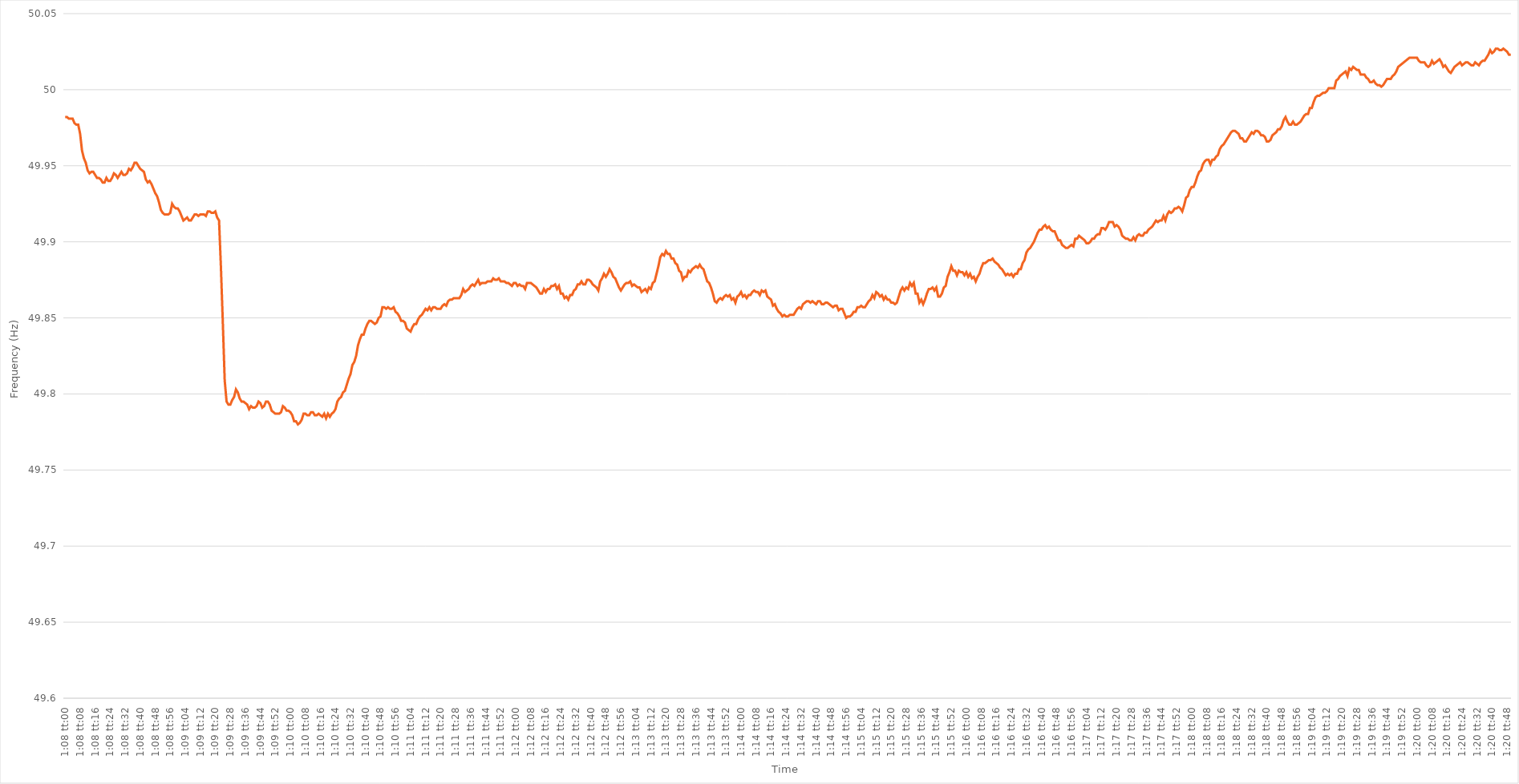
| Category | Series 0 |
|---|---|
| 0.04722222222222222 | 49.982 |
| 0.047233796296296295 | 49.982 |
| 0.047245370370370375 | 49.981 |
| 0.04725694444444445 | 49.981 |
| 0.047268518518518515 | 49.981 |
| 0.04728009259259259 | 49.978 |
| 0.04729166666666667 | 49.977 |
| 0.04730324074074074 | 49.977 |
| 0.04731481481481481 | 49.971 |
| 0.04732638888888888 | 49.96 |
| 0.047337962962962964 | 49.955 |
| 0.04734953703703704 | 49.952 |
| 0.04736111111111111 | 49.947 |
| 0.04737268518518519 | 49.945 |
| 0.04738425925925926 | 49.946 |
| 0.04739583333333333 | 49.946 |
| 0.047407407407407405 | 49.944 |
| 0.047418981481481486 | 49.942 |
| 0.04743055555555556 | 49.942 |
| 0.047442129629629626 | 49.941 |
| 0.0474537037037037 | 49.939 |
| 0.04746527777777778 | 49.939 |
| 0.04747685185185185 | 49.942 |
| 0.04748842592592593 | 49.94 |
| 0.04750000000000001 | 49.94 |
| 0.047511574074074074 | 49.942 |
| 0.04752314814814815 | 49.945 |
| 0.04753472222222222 | 49.944 |
| 0.0475462962962963 | 49.942 |
| 0.04755787037037037 | 49.944 |
| 0.04756944444444444 | 49.946 |
| 0.047581018518518516 | 49.944 |
| 0.047592592592592596 | 49.944 |
| 0.04760416666666667 | 49.945 |
| 0.04761574074074074 | 49.948 |
| 0.04762731481481481 | 49.947 |
| 0.04763888888888889 | 49.949 |
| 0.047650462962962964 | 49.952 |
| 0.04766203703703704 | 49.952 |
| 0.047673611111111104 | 49.95 |
| 0.047685185185185185 | 49.948 |
| 0.04769675925925926 | 49.947 |
| 0.04770833333333333 | 49.946 |
| 0.04771990740740741 | 49.941 |
| 0.047731481481481486 | 49.939 |
| 0.04774305555555555 | 49.94 |
| 0.047754629629629626 | 49.938 |
| 0.04776620370370371 | 49.935 |
| 0.04777777777777778 | 49.932 |
| 0.04778935185185185 | 49.93 |
| 0.04780092592592592 | 49.926 |
| 0.0478125 | 49.921 |
| 0.047824074074074074 | 49.919 |
| 0.04783564814814815 | 49.918 |
| 0.04784722222222223 | 49.918 |
| 0.047858796296296295 | 49.918 |
| 0.04787037037037037 | 49.919 |
| 0.04788194444444444 | 49.925 |
| 0.04789351851851852 | 49.923 |
| 0.04790509259259259 | 49.922 |
| 0.04791666666666666 | 49.922 |
| 0.04792824074074074 | 49.92 |
| 0.04793981481481482 | 49.917 |
| 0.04795138888888889 | 49.914 |
| 0.047962962962962964 | 49.915 |
| 0.047974537037037045 | 49.916 |
| 0.04798611111111111 | 49.914 |
| 0.047997685185185185 | 49.914 |
| 0.04800925925925926 | 49.916 |
| 0.04802083333333334 | 49.918 |
| 0.048032407407407406 | 49.918 |
| 0.04804398148148148 | 49.917 |
| 0.04805555555555555 | 49.918 |
| 0.04806712962962963 | 49.918 |
| 0.04807870370370371 | 49.918 |
| 0.04809027777777778 | 49.917 |
| 0.04810185185185185 | 49.92 |
| 0.04811342592592593 | 49.92 |
| 0.048125 | 49.919 |
| 0.048136574074074075 | 49.919 |
| 0.04814814814814814 | 49.92 |
| 0.04815972222222222 | 49.916 |
| 0.048171296296296295 | 49.914 |
| 0.04818287037037037 | 49.883 |
| 0.04819444444444445 | 49.847 |
| 0.04820601851851852 | 49.809 |
| 0.04821759259259259 | 49.795 |
| 0.04822916666666666 | 49.793 |
| 0.048240740740740744 | 49.793 |
| 0.04825231481481482 | 49.796 |
| 0.048263888888888884 | 49.798 |
| 0.04827546296296296 | 49.803 |
| 0.04828703703703704 | 49.801 |
| 0.04829861111111111 | 49.797 |
| 0.048310185185185185 | 49.795 |
| 0.048321759259259266 | 49.795 |
| 0.04833333333333333 | 49.794 |
| 0.048344907407407406 | 49.793 |
| 0.04835648148148148 | 49.79 |
| 0.04836805555555556 | 49.792 |
| 0.04837962962962963 | 49.791 |
| 0.0483912037037037 | 49.791 |
| 0.048402777777777774 | 49.792 |
| 0.048414351851851854 | 49.795 |
| 0.04842592592592593 | 49.794 |
| 0.0484375 | 49.791 |
| 0.04844907407407408 | 49.792 |
| 0.04846064814814815 | 49.795 |
| 0.04847222222222222 | 49.795 |
| 0.048483796296296296 | 49.793 |
| 0.048495370370370376 | 49.789 |
| 0.04850694444444444 | 49.788 |
| 0.048518518518518516 | 49.787 |
| 0.04853009259259259 | 49.787 |
| 0.04854166666666667 | 49.787 |
| 0.048553240740740744 | 49.788 |
| 0.04856481481481482 | 49.792 |
| 0.048576388888888884 | 49.791 |
| 0.048587962962962965 | 49.789 |
| 0.04859953703703704 | 49.789 |
| 0.04861111111111111 | 49.788 |
| 0.04862268518518518 | 49.786 |
| 0.04863425925925926 | 49.782 |
| 0.04864583333333333 | 49.782 |
| 0.048657407407407406 | 49.78 |
| 0.04866898148148149 | 49.781 |
| 0.04868055555555556 | 49.783 |
| 0.04869212962962963 | 49.787 |
| 0.0487037037037037 | 49.787 |
| 0.04871527777777778 | 49.786 |
| 0.048726851851851855 | 49.786 |
| 0.04873842592592592 | 49.788 |
| 0.048749999999999995 | 49.788 |
| 0.048761574074074075 | 49.786 |
| 0.04877314814814815 | 49.786 |
| 0.04878472222222222 | 49.787 |
| 0.0487962962962963 | 49.786 |
| 0.04880787037037037 | 49.785 |
| 0.04881944444444444 | 49.787 |
| 0.04883101851851852 | 49.784 |
| 0.0488425925925926 | 49.787 |
| 0.048854166666666664 | 49.785 |
| 0.04886574074074074 | 49.787 |
| 0.04887731481481481 | 49.788 |
| 0.04888888888888889 | 49.79 |
| 0.048900462962962965 | 49.795 |
| 0.04891203703703704 | 49.797 |
| 0.048923611111111105 | 49.798 |
| 0.048935185185185186 | 49.801 |
| 0.04894675925925926 | 49.802 |
| 0.04895833333333333 | 49.806 |
| 0.04896990740740741 | 49.81 |
| 0.04898148148148148 | 49.813 |
| 0.048993055555555554 | 49.819 |
| 0.04900462962962963 | 49.821 |
| 0.04901620370370371 | 49.825 |
| 0.04902777777777778 | 49.832 |
| 0.049039351851851855 | 49.836 |
| 0.04905092592592592 | 49.839 |
| 0.0490625 | 49.839 |
| 0.049074074074074076 | 49.843 |
| 0.04908564814814815 | 49.846 |
| 0.049097222222222216 | 49.848 |
| 0.049108796296296296 | 49.848 |
| 0.04912037037037037 | 49.847 |
| 0.04913194444444444 | 49.846 |
| 0.049143518518518524 | 49.847 |
| 0.0491550925925926 | 49.85 |
| 0.049166666666666664 | 49.851 |
| 0.04917824074074074 | 49.857 |
| 0.04918981481481482 | 49.857 |
| 0.04920138888888889 | 49.856 |
| 0.04921296296296296 | 49.857 |
| 0.04922453703703703 | 49.856 |
| 0.04923611111111111 | 49.856 |
| 0.049247685185185186 | 49.857 |
| 0.04925925925925926 | 49.854 |
| 0.04927083333333334 | 49.853 |
| 0.04928240740740741 | 49.851 |
| 0.04929398148148148 | 49.848 |
| 0.049305555555555554 | 49.848 |
| 0.049317129629629634 | 49.847 |
| 0.0493287037037037 | 49.843 |
| 0.049340277777777775 | 49.842 |
| 0.04935185185185185 | 49.841 |
| 0.04936342592592593 | 49.844 |
| 0.049375 | 49.846 |
| 0.049386574074074076 | 49.846 |
| 0.04939814814814814 | 49.849 |
| 0.04940972222222222 | 49.851 |
| 0.049421296296296297 | 49.852 |
| 0.04943287037037037 | 49.854 |
| 0.04944444444444444 | 49.856 |
| 0.04945601851851852 | 49.855 |
| 0.04946759259259259 | 49.857 |
| 0.049479166666666664 | 49.855 |
| 0.049490740740740745 | 49.857 |
| 0.04950231481481482 | 49.857 |
| 0.04951388888888889 | 49.856 |
| 0.04952546296296296 | 49.856 |
| 0.04953703703703704 | 49.856 |
| 0.04954861111111111 | 49.858 |
| 0.049560185185185186 | 49.859 |
| 0.04957175925925925 | 49.858 |
| 0.04958333333333333 | 49.861 |
| 0.04959490740740741 | 49.862 |
| 0.04960648148148148 | 49.862 |
| 0.04961805555555556 | 49.863 |
| 0.049629629629629635 | 49.863 |
| 0.0496412037037037 | 49.863 |
| 0.049652777777777775 | 49.863 |
| 0.049664351851851855 | 49.865 |
| 0.04967592592592593 | 49.869 |
| 0.049687499999999996 | 49.867 |
| 0.04969907407407407 | 49.868 |
| 0.04971064814814815 | 49.869 |
| 0.04972222222222222 | 49.871 |
| 0.0497337962962963 | 49.872 |
| 0.04974537037037038 | 49.871 |
| 0.049756944444444444 | 49.873 |
| 0.04976851851851852 | 49.875 |
| 0.04978009259259259 | 49.872 |
| 0.04979166666666667 | 49.873 |
| 0.04980324074074074 | 49.873 |
| 0.04981481481481481 | 49.873 |
| 0.049826388888888885 | 49.874 |
| 0.049837962962962966 | 49.874 |
| 0.04984953703703704 | 49.874 |
| 0.04986111111111111 | 49.876 |
| 0.04987268518518518 | 49.875 |
| 0.04988425925925926 | 49.875 |
| 0.049895833333333334 | 49.876 |
| 0.04990740740740741 | 49.874 |
| 0.049918981481481474 | 49.874 |
| 0.049930555555555554 | 49.874 |
| 0.04994212962962963 | 49.873 |
| 0.0499537037037037 | 49.873 |
| 0.04996527777777778 | 49.872 |
| 0.049976851851851856 | 49.871 |
| 0.04998842592592592 | 49.873 |
| 0.049999999999999996 | 49.873 |
| 0.050011574074074076 | 49.871 |
| 0.05002314814814815 | 49.872 |
| 0.050034722222222223 | 49.871 |
| 0.05004629629629629 | 49.871 |
| 0.05005787037037037 | 49.869 |
| 0.050069444444444444 | 49.873 |
| 0.05008101851851852 | 49.873 |
| 0.0500925925925926 | 49.873 |
| 0.05010416666666667 | 49.872 |
| 0.05011574074074074 | 49.871 |
| 0.05012731481481481 | 49.87 |
| 0.05013888888888889 | 49.868 |
| 0.050150462962962966 | 49.866 |
| 0.05016203703703703 | 49.866 |
| 0.050173611111111106 | 49.869 |
| 0.05018518518518519 | 49.867 |
| 0.05019675925925926 | 49.869 |
| 0.050208333333333334 | 49.869 |
| 0.050219907407407414 | 49.871 |
| 0.05023148148148148 | 49.871 |
| 0.050243055555555555 | 49.872 |
| 0.05025462962962963 | 49.869 |
| 0.05026620370370371 | 49.871 |
| 0.050277777777777775 | 49.866 |
| 0.05028935185185185 | 49.866 |
| 0.05030092592592592 | 49.863 |
| 0.0503125 | 49.864 |
| 0.05032407407407408 | 49.862 |
| 0.05033564814814815 | 49.865 |
| 0.05034722222222222 | 49.865 |
| 0.0503587962962963 | 49.868 |
| 0.05037037037037037 | 49.869 |
| 0.050381944444444444 | 49.872 |
| 0.05039351851851851 | 49.872 |
| 0.05040509259259259 | 49.874 |
| 0.050416666666666665 | 49.872 |
| 0.05042824074074074 | 49.872 |
| 0.05043981481481482 | 49.875 |
| 0.05045138888888889 | 49.875 |
| 0.05046296296296296 | 49.874 |
| 0.05047453703703703 | 49.872 |
| 0.050486111111111114 | 49.871 |
| 0.05049768518518519 | 49.87 |
| 0.050509259259259254 | 49.868 |
| 0.05052083333333333 | 49.874 |
| 0.05053240740740741 | 49.876 |
| 0.05054398148148148 | 49.879 |
| 0.050555555555555555 | 49.877 |
| 0.050567129629629635 | 49.879 |
| 0.05057870370370371 | 49.882 |
| 0.050590277777777776 | 49.88 |
| 0.05060185185185185 | 49.877 |
| 0.05061342592592593 | 49.876 |
| 0.050625 | 49.873 |
| 0.05063657407407407 | 49.87 |
| 0.050648148148148144 | 49.868 |
| 0.050659722222222224 | 49.87 |
| 0.0506712962962963 | 49.872 |
| 0.05068287037037037 | 49.873 |
| 0.05069444444444445 | 49.873 |
| 0.05070601851851852 | 49.874 |
| 0.05071759259259259 | 49.871 |
| 0.050729166666666665 | 49.872 |
| 0.050740740740740746 | 49.871 |
| 0.05075231481481481 | 49.87 |
| 0.050763888888888886 | 49.87 |
| 0.05077546296296296 | 49.867 |
| 0.05078703703703704 | 49.868 |
| 0.050798611111111114 | 49.869 |
| 0.05081018518518519 | 49.867 |
| 0.050821759259259254 | 49.87 |
| 0.050833333333333335 | 49.869 |
| 0.05084490740740741 | 49.873 |
| 0.05085648148148148 | 49.874 |
| 0.05086805555555555 | 49.879 |
| 0.05087962962962963 | 49.884 |
| 0.0508912037037037 | 49.89 |
| 0.050902777777777776 | 49.892 |
| 0.050914351851851856 | 49.891 |
| 0.05092592592592593 | 49.894 |
| 0.0509375 | 49.892 |
| 0.05094907407407407 | 49.892 |
| 0.05096064814814815 | 49.889 |
| 0.050972222222222224 | 49.889 |
| 0.05098379629629629 | 49.886 |
| 0.050995370370370365 | 49.885 |
| 0.051006944444444445 | 49.881 |
| 0.05101851851851852 | 49.88 |
| 0.05103009259259259 | 49.875 |
| 0.05104166666666667 | 49.877 |
| 0.051053240740740746 | 49.877 |
| 0.05106481481481481 | 49.881 |
| 0.051076388888888886 | 49.88 |
| 0.05108796296296297 | 49.882 |
| 0.05109953703703704 | 49.883 |
| 0.05111111111111111 | 49.884 |
| 0.05112268518518518 | 49.883 |
| 0.05113425925925926 | 49.885 |
| 0.051145833333333335 | 49.883 |
| 0.05115740740740741 | 49.882 |
| 0.05116898148148149 | 49.878 |
| 0.051180555555555556 | 49.874 |
| 0.05119212962962963 | 49.873 |
| 0.0512037037037037 | 49.87 |
| 0.05121527777777778 | 49.866 |
| 0.05122685185185185 | 49.861 |
| 0.05123842592592592 | 49.86 |
| 0.05125 | 49.862 |
| 0.05126157407407408 | 49.863 |
| 0.05127314814814815 | 49.862 |
| 0.051284722222222225 | 49.864 |
| 0.05129629629629629 | 49.865 |
| 0.05130787037037037 | 49.864 |
| 0.051319444444444445 | 49.865 |
| 0.05133101851851852 | 49.862 |
| 0.051342592592592586 | 49.863 |
| 0.051354166666666666 | 49.86 |
| 0.05136574074074074 | 49.864 |
| 0.05137731481481481 | 49.865 |
| 0.051388888888888894 | 49.867 |
| 0.05140046296296297 | 49.864 |
| 0.051412037037037034 | 49.865 |
| 0.05142361111111111 | 49.863 |
| 0.05143518518518519 | 49.865 |
| 0.05144675925925926 | 49.865 |
| 0.05145833333333333 | 49.867 |
| 0.0514699074074074 | 49.868 |
| 0.05148148148148148 | 49.867 |
| 0.051493055555555556 | 49.867 |
| 0.05150462962962963 | 49.865 |
| 0.05151620370370371 | 49.868 |
| 0.051527777777777777 | 49.867 |
| 0.05153935185185185 | 49.868 |
| 0.051550925925925924 | 49.864 |
| 0.051562500000000004 | 49.863 |
| 0.05157407407407408 | 49.862 |
| 0.051585648148148144 | 49.858 |
| 0.05159722222222222 | 49.859 |
| 0.0516087962962963 | 49.856 |
| 0.05162037037037037 | 49.854 |
| 0.051631944444444446 | 49.853 |
| 0.051643518518518526 | 49.851 |
| 0.05165509259259259 | 49.852 |
| 0.051666666666666666 | 49.851 |
| 0.05167824074074074 | 49.851 |
| 0.05168981481481482 | 49.852 |
| 0.05170138888888889 | 49.852 |
| 0.05171296296296296 | 49.852 |
| 0.051724537037037034 | 49.854 |
| 0.051736111111111115 | 49.856 |
| 0.05174768518518519 | 49.857 |
| 0.05175925925925926 | 49.856 |
| 0.05177083333333333 | 49.859 |
| 0.05178240740740741 | 49.86 |
| 0.05179398148148148 | 49.861 |
| 0.051805555555555556 | 49.861 |
| 0.05181712962962962 | 49.86 |
| 0.0518287037037037 | 49.861 |
| 0.05184027777777778 | 49.86 |
| 0.05185185185185185 | 49.859 |
| 0.05186342592592593 | 49.861 |
| 0.051875000000000004 | 49.861 |
| 0.05188657407407407 | 49.859 |
| 0.051898148148148145 | 49.859 |
| 0.051909722222222225 | 49.86 |
| 0.0519212962962963 | 49.86 |
| 0.051932870370370365 | 49.859 |
| 0.05194444444444444 | 49.858 |
| 0.05195601851851852 | 49.857 |
| 0.05196759259259259 | 49.858 |
| 0.05197916666666667 | 49.858 |
| 0.05199074074074075 | 49.855 |
| 0.052002314814814814 | 49.856 |
| 0.05201388888888889 | 49.856 |
| 0.05202546296296296 | 49.853 |
| 0.05203703703703704 | 49.85 |
| 0.05204861111111111 | 49.851 |
| 0.05206018518518518 | 49.851 |
| 0.052071759259259255 | 49.852 |
| 0.052083333333333336 | 49.854 |
| 0.05209490740740741 | 49.854 |
| 0.05210648148148148 | 49.857 |
| 0.05211805555555556 | 49.857 |
| 0.05212962962962963 | 49.858 |
| 0.052141203703703703 | 49.857 |
| 0.05215277777777778 | 49.857 |
| 0.05216435185185186 | 49.859 |
| 0.052175925925925924 | 49.861 |
| 0.0521875 | 49.862 |
| 0.05219907407407407 | 49.865 |
| 0.05221064814814815 | 49.863 |
| 0.052222222222222225 | 49.867 |
| 0.0522337962962963 | 49.866 |
| 0.052245370370370366 | 49.864 |
| 0.052256944444444446 | 49.865 |
| 0.05226851851851852 | 49.862 |
| 0.05228009259259259 | 49.864 |
| 0.05229166666666666 | 49.862 |
| 0.05230324074074074 | 49.862 |
| 0.052314814814814814 | 49.86 |
| 0.05232638888888889 | 49.86 |
| 0.05233796296296297 | 49.859 |
| 0.05234953703703704 | 49.86 |
| 0.05236111111111111 | 49.864 |
| 0.05237268518518518 | 49.868 |
| 0.05238425925925926 | 49.87 |
| 0.052395833333333336 | 49.868 |
| 0.0524074074074074 | 49.87 |
| 0.052418981481481476 | 49.869 |
| 0.05243055555555556 | 49.873 |
| 0.05244212962962963 | 49.871 |
| 0.052453703703703704 | 49.873 |
| 0.052465277777777784 | 49.866 |
| 0.05247685185185185 | 49.866 |
| 0.052488425925925924 | 49.86 |
| 0.0525 | 49.862 |
| 0.05251157407407408 | 49.859 |
| 0.052523148148148145 | 49.862 |
| 0.05253472222222222 | 49.866 |
| 0.05254629629629629 | 49.869 |
| 0.05255787037037037 | 49.869 |
| 0.052569444444444446 | 49.87 |
| 0.05258101851851852 | 49.868 |
| 0.05259259259259259 | 49.87 |
| 0.05260416666666667 | 49.864 |
| 0.05261574074074074 | 49.864 |
| 0.052627314814814814 | 49.866 |
| 0.052638888888888895 | 49.87 |
| 0.05265046296296296 | 49.871 |
| 0.052662037037037035 | 49.877 |
| 0.05267361111111111 | 49.88 |
| 0.05268518518518519 | 49.884 |
| 0.05269675925925926 | 49.881 |
| 0.052708333333333336 | 49.881 |
| 0.0527199074074074 | 49.878 |
| 0.05273148148148148 | 49.881 |
| 0.05274305555555556 | 49.88 |
| 0.05275462962962963 | 49.88 |
| 0.0527662037037037 | 49.878 |
| 0.05277777777777778 | 49.88 |
| 0.05278935185185185 | 49.877 |
| 0.052800925925925925 | 49.879 |
| 0.052812500000000005 | 49.876 |
| 0.05282407407407408 | 49.877 |
| 0.052835648148148145 | 49.874 |
| 0.05284722222222222 | 49.877 |
| 0.0528587962962963 | 49.879 |
| 0.05287037037037037 | 49.883 |
| 0.05288194444444444 | 49.886 |
| 0.05289351851851851 | 49.886 |
| 0.052905092592592594 | 49.887 |
| 0.05291666666666667 | 49.888 |
| 0.05292824074074074 | 49.888 |
| 0.05293981481481482 | 49.889 |
| 0.05295138888888889 | 49.887 |
| 0.05296296296296296 | 49.886 |
| 0.052974537037037035 | 49.885 |
| 0.052986111111111116 | 49.883 |
| 0.05299768518518518 | 49.882 |
| 0.053009259259259256 | 49.88 |
| 0.05302083333333333 | 49.878 |
| 0.05303240740740741 | 49.879 |
| 0.053043981481481484 | 49.878 |
| 0.05305555555555556 | 49.879 |
| 0.05306712962962964 | 49.877 |
| 0.053078703703703704 | 49.879 |
| 0.05309027777777778 | 49.879 |
| 0.05310185185185185 | 49.882 |
| 0.05311342592592593 | 49.882 |
| 0.053125 | 49.886 |
| 0.05313657407407407 | 49.888 |
| 0.053148148148148146 | 49.893 |
| 0.053159722222222226 | 49.895 |
| 0.0531712962962963 | 49.896 |
| 0.053182870370370366 | 49.898 |
| 0.05319444444444444 | 49.9 |
| 0.05320601851851852 | 49.903 |
| 0.053217592592592594 | 49.906 |
| 0.05322916666666666 | 49.908 |
| 0.053240740740740734 | 49.908 |
| 0.053252314814814815 | 49.91 |
| 0.05326388888888889 | 49.911 |
| 0.05327546296296296 | 49.909 |
| 0.05328703703703704 | 49.91 |
| 0.053298611111111116 | 49.908 |
| 0.05331018518518518 | 49.907 |
| 0.053321759259259256 | 49.907 |
| 0.05333333333333334 | 49.904 |
| 0.05334490740740741 | 49.901 |
| 0.05335648148148148 | 49.901 |
| 0.05336805555555555 | 49.898 |
| 0.05337962962962963 | 49.897 |
| 0.053391203703703705 | 49.896 |
| 0.05340277777777778 | 49.896 |
| 0.05341435185185186 | 49.897 |
| 0.053425925925925925 | 49.898 |
| 0.0534375 | 49.897 |
| 0.05344907407407407 | 49.902 |
| 0.05346064814814815 | 49.902 |
| 0.05347222222222222 | 49.904 |
| 0.05348379629629629 | 49.903 |
| 0.05349537037037037 | 49.902 |
| 0.05350694444444445 | 49.901 |
| 0.05351851851851852 | 49.899 |
| 0.053530092592592594 | 49.899 |
| 0.053541666666666675 | 49.9 |
| 0.05355324074074074 | 49.902 |
| 0.053564814814814815 | 49.902 |
| 0.05357638888888889 | 49.904 |
| 0.05358796296296297 | 49.905 |
| 0.053599537037037036 | 49.905 |
| 0.05361111111111111 | 49.909 |
| 0.05362268518518518 | 49.909 |
| 0.05363425925925926 | 49.908 |
| 0.05364583333333334 | 49.91 |
| 0.053657407407407404 | 49.913 |
| 0.05366898148148148 | 49.913 |
| 0.05368055555555556 | 49.913 |
| 0.05369212962962963 | 49.91 |
| 0.0537037037037037 | 49.911 |
| 0.05371527777777777 | 49.91 |
| 0.05372685185185185 | 49.908 |
| 0.053738425925925926 | 49.904 |
| 0.05375 | 49.903 |
| 0.05376157407407408 | 49.902 |
| 0.05377314814814815 | 49.902 |
| 0.05378472222222222 | 49.901 |
| 0.05379629629629629 | 49.901 |
| 0.053807870370370374 | 49.903 |
| 0.05381944444444445 | 49.901 |
| 0.053831018518518514 | 49.904 |
| 0.05384259259259259 | 49.905 |
| 0.05385416666666667 | 49.904 |
| 0.05386574074074074 | 49.904 |
| 0.053877314814814815 | 49.906 |
| 0.053888888888888896 | 49.906 |
| 0.05390046296296296 | 49.908 |
| 0.053912037037037036 | 49.909 |
| 0.05392361111111111 | 49.91 |
| 0.05393518518518519 | 49.912 |
| 0.05394675925925926 | 49.914 |
| 0.05395833333333333 | 49.913 |
| 0.053969907407407404 | 49.914 |
| 0.053981481481481484 | 49.914 |
| 0.05399305555555556 | 49.917 |
| 0.05400462962962963 | 49.914 |
| 0.05401620370370371 | 49.918 |
| 0.05402777777777778 | 49.92 |
| 0.05403935185185185 | 49.919 |
| 0.054050925925925926 | 49.92 |
| 0.054062500000000006 | 49.922 |
| 0.05407407407407407 | 49.922 |
| 0.05408564814814815 | 49.923 |
| 0.05409722222222222 | 49.922 |
| 0.0541087962962963 | 49.92 |
| 0.054120370370370374 | 49.924 |
| 0.05413194444444444 | 49.929 |
| 0.054143518518518514 | 49.93 |
| 0.054155092592592595 | 49.934 |
| 0.05416666666666667 | 49.936 |
| 0.054178240740740735 | 49.936 |
| 0.05418981481481481 | 49.939 |
| 0.05420138888888889 | 49.943 |
| 0.05421296296296296 | 49.946 |
| 0.054224537037037036 | 49.947 |
| 0.05423611111111112 | 49.951 |
| 0.05424768518518519 | 49.953 |
| 0.05425925925925926 | 49.954 |
| 0.05427083333333333 | 49.954 |
| 0.05428240740740741 | 49.951 |
| 0.054293981481481485 | 49.954 |
| 0.05430555555555555 | 49.954 |
| 0.054317129629629625 | 49.956 |
| 0.054328703703703705 | 49.957 |
| 0.05434027777777778 | 49.961 |
| 0.05435185185185185 | 49.963 |
| 0.05436342592592593 | 49.964 |
| 0.054375 | 49.966 |
| 0.05438657407407407 | 49.968 |
| 0.05439814814814815 | 49.97 |
| 0.05440972222222223 | 49.972 |
| 0.054421296296296294 | 49.973 |
| 0.05443287037037037 | 49.973 |
| 0.05444444444444444 | 49.972 |
| 0.05445601851851852 | 49.971 |
| 0.054467592592592595 | 49.968 |
| 0.05447916666666667 | 49.968 |
| 0.054490740740740735 | 49.966 |
| 0.054502314814814816 | 49.966 |
| 0.05451388888888889 | 49.968 |
| 0.05452546296296296 | 49.97 |
| 0.054537037037037044 | 49.972 |
| 0.05454861111111111 | 49.971 |
| 0.054560185185185184 | 49.973 |
| 0.05457175925925926 | 49.973 |
| 0.05458333333333334 | 49.972 |
| 0.05459490740740741 | 49.97 |
| 0.05460648148148148 | 49.97 |
| 0.05461805555555555 | 49.969 |
| 0.05462962962962963 | 49.966 |
| 0.054641203703703706 | 49.966 |
| 0.05465277777777777 | 49.967 |
| 0.054664351851851846 | 49.97 |
| 0.054675925925925926 | 49.971 |
| 0.0546875 | 49.972 |
| 0.054699074074074074 | 49.974 |
| 0.054710648148148154 | 49.974 |
| 0.05472222222222223 | 49.976 |
| 0.054733796296296294 | 49.98 |
| 0.05474537037037037 | 49.982 |
| 0.05475694444444445 | 49.979 |
| 0.05476851851851852 | 49.977 |
| 0.05478009259259259 | 49.977 |
| 0.05479166666666666 | 49.979 |
| 0.05480324074074074 | 49.977 |
| 0.054814814814814816 | 49.977 |
| 0.05482638888888889 | 49.978 |
| 0.054837962962962956 | 49.979 |
| 0.05484953703703704 | 49.981 |
| 0.05486111111111111 | 49.983 |
| 0.054872685185185184 | 49.984 |
| 0.054884259259259265 | 49.984 |
| 0.05489583333333333 | 49.988 |
| 0.054907407407407405 | 49.988 |
| 0.05491898148148148 | 49.992 |
| 0.05493055555555556 | 49.995 |
| 0.05494212962962963 | 49.996 |
| 0.054953703703703706 | 49.996 |
| 0.05496527777777777 | 49.997 |
| 0.05497685185185185 | 49.998 |
| 0.05498842592592593 | 49.998 |
| 0.055 | 49.999 |
| 0.05501157407407407 | 50.001 |
| 0.05502314814814815 | 50.001 |
| 0.05503472222222222 | 50.001 |
| 0.055046296296296295 | 50.001 |
| 0.055057870370370375 | 50.006 |
| 0.05506944444444445 | 50.007 |
| 0.055081018518518515 | 50.009 |
| 0.05509259259259259 | 50.01 |
| 0.05510416666666667 | 50.011 |
| 0.05511574074074074 | 50.012 |
| 0.05512731481481481 | 50.009 |
| 0.05513888888888888 | 50.014 |
| 0.055150462962962964 | 50.013 |
| 0.05516203703703704 | 50.015 |
| 0.05517361111111111 | 50.014 |
| 0.05518518518518519 | 50.013 |
| 0.055196759259259265 | 50.013 |
| 0.05520833333333333 | 50.01 |
| 0.055219907407407405 | 50.01 |
| 0.055231481481481486 | 50.01 |
| 0.05524305555555556 | 50.008 |
| 0.055254629629629626 | 50.007 |
| 0.0552662037037037 | 50.005 |
| 0.05527777777777778 | 50.005 |
| 0.05528935185185185 | 50.006 |
| 0.05530092592592593 | 50.004 |
| 0.055312499999999994 | 50.003 |
| 0.055324074074074074 | 50.003 |
| 0.05533564814814815 | 50.002 |
| 0.05534722222222222 | 50.003 |
| 0.05535879629629629 | 50.005 |
| 0.05537037037037037 | 50.007 |
| 0.05538194444444444 | 50.007 |
| 0.055393518518518516 | 50.007 |
| 0.055405092592592596 | 50.009 |
| 0.05541666666666667 | 50.01 |
| 0.05542824074074074 | 50.012 |
| 0.05543981481481481 | 50.015 |
| 0.05545138888888889 | 50.016 |
| 0.055462962962962964 | 50.017 |
| 0.05547453703703704 | 50.018 |
| 0.055486111111111104 | 50.019 |
| 0.055497685185185185 | 50.02 |
| 0.05550925925925926 | 50.021 |
| 0.05552083333333333 | 50.021 |
| 0.05553240740740741 | 50.021 |
| 0.055543981481481486 | 50.021 |
| 0.05555555555555555 | 50.021 |
| 0.055567129629629626 | 50.019 |
| 0.05557870370370371 | 50.018 |
| 0.05559027777777778 | 50.018 |
| 0.05560185185185185 | 50.018 |
| 0.05561342592592592 | 50.016 |
| 0.055625 | 50.015 |
| 0.055636574074074074 | 50.016 |
| 0.05564814814814815 | 50.019 |
| 0.05565972222222223 | 50.017 |
| 0.0556712962962963 | 50.018 |
| 0.05568287037037037 | 50.019 |
| 0.05569444444444444 | 50.02 |
| 0.05570601851851852 | 50.018 |
| 0.055717592592592596 | 50.015 |
| 0.05572916666666666 | 50.016 |
| 0.05574074074074074 | 50.014 |
| 0.05575231481481482 | 50.012 |
| 0.05576388888888889 | 50.011 |
| 0.055775462962962964 | 50.013 |
| 0.05578703703703703 | 50.015 |
| 0.05579861111111111 | 50.016 |
| 0.055810185185185185 | 50.017 |
| 0.05582175925925926 | 50.018 |
| 0.055833333333333325 | 50.016 |
| 0.055844907407407406 | 50.017 |
| 0.05585648148148148 | 50.018 |
| 0.05586805555555555 | 50.018 |
| 0.05587962962962963 | 50.017 |
| 0.05589120370370371 | 50.016 |
| 0.05590277777777778 | 50.016 |
| 0.05591435185185185 | 50.018 |
| 0.05592592592592593 | 50.017 |
| 0.0559375 | 50.016 |
| 0.055949074074074075 | 50.018 |
| 0.05596064814814814 | 50.019 |
| 0.05597222222222222 | 50.019 |
| 0.055983796296296295 | 50.021 |
| 0.05599537037037037 | 50.023 |
| 0.05600694444444445 | 50.026 |
| 0.05601851851851852 | 50.024 |
| 0.05603009259259259 | 50.025 |
| 0.05604166666666666 | 50.027 |
| 0.056053240740740744 | 50.027 |
| 0.05606481481481482 | 50.026 |
| 0.056076388888888884 | 50.026 |
| 0.05608796296296296 | 50.027 |
| 0.05609953703703704 | 50.026 |
| 0.05611111111111111 | 50.025 |
| 0.056122685185185185 | 50.023 |
| 0.056134259259259266 | 50.023 |